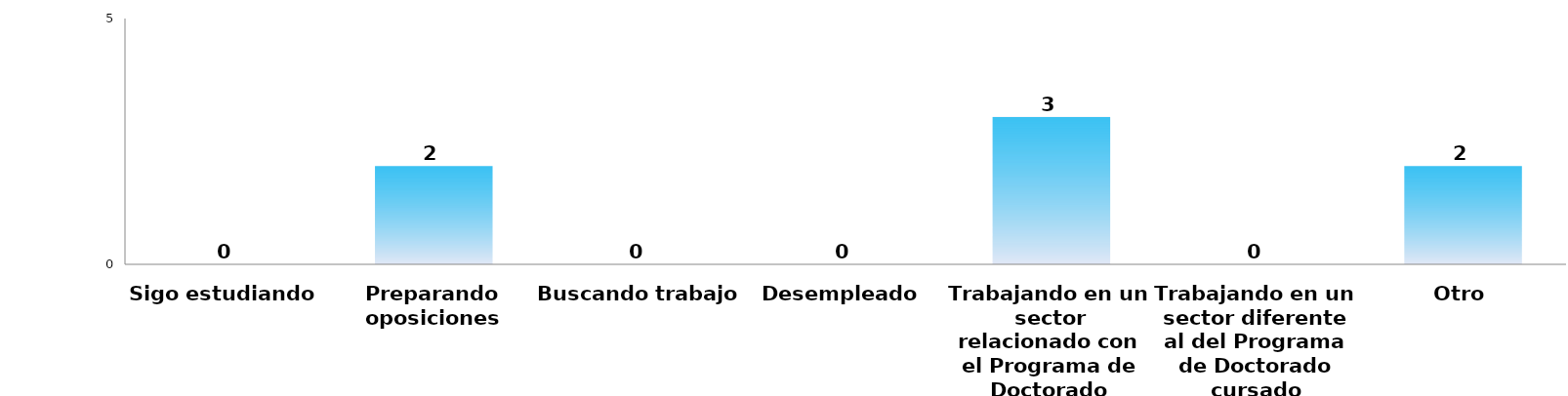
| Category | Series 0 |
|---|---|
| Sigo estudiando | 0 |
| Preparando oposiciones | 2 |
| Buscando trabajo | 0 |
| Desempleado | 0 |
| Trabajando en un sector relacionado con el Programa de Doctorado cursado | 3 |
| Trabajando en un sector diferente al del Programa de Doctorado cursado | 0 |
| Otro | 2 |